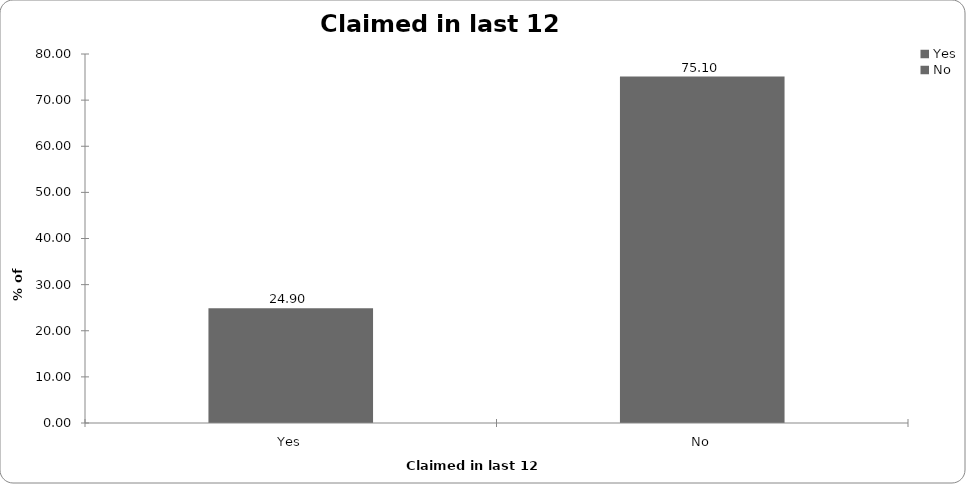
| Category | Claimed in last 12 months |
|---|---|
| Yes | 24.9 |
| No | 75.1 |